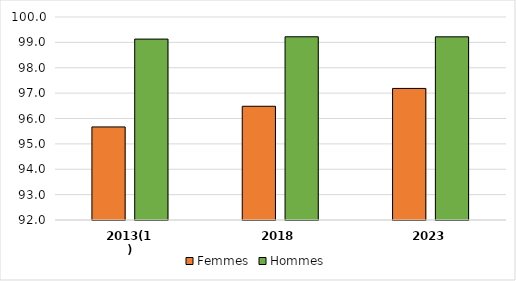
| Category | Femmes | Hommes |
|---|---|---|
| 2013(1) | 95.668 | 99.13 |
| 2018 | 96.482 | 99.221 |
| 2023 | 97.185 | 99.219 |